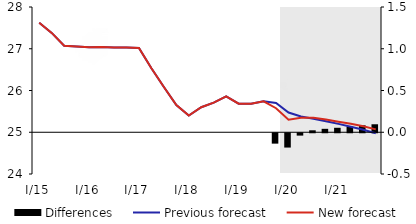
| Category | Differences |
|---|---|
| 0 | 0 |
| 1 | 0 |
| 2 | 0 |
| 3 | 0 |
| 4 | 0 |
| 5 | 0 |
| 6 | 0 |
| 7 | 0 |
| 8 | 0 |
| 9 | 0 |
| 10 | 0 |
| 11 | 0 |
| 12 | 0 |
| 13 | 0 |
| 14 | 0 |
| 15 | 0 |
| 16 | 0 |
| 17 | 0 |
| 18 | 0 |
| 19 | -0.124 |
| 20 | -0.171 |
| 21 | -0.028 |
| 22 | 0.023 |
| 23 | 0.041 |
| 24 | 0.054 |
| 25 | 0.069 |
| 26 | 0.084 |
| 27 | 0.096 |